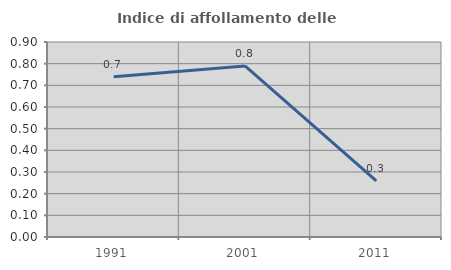
| Category | Indice di affollamento delle abitazioni  |
|---|---|
| 1991.0 | 0.74 |
| 2001.0 | 0.79 |
| 2011.0 | 0.259 |